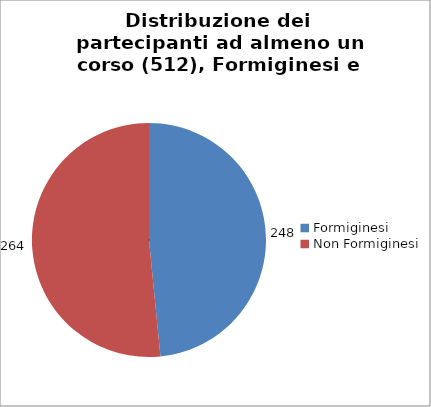
| Category | Nr. Tesserati |
|---|---|
| Formiginesi | 248 |
| Non Formiginesi | 264 |